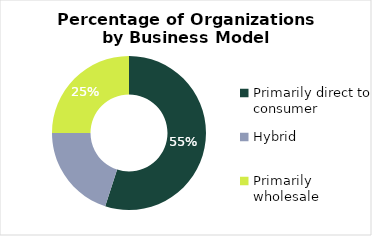
| Category | Total |
|---|---|
| Primarily direct to consumer | 0.55 |
| Hybrid | 0.2 |
| Primarily wholesale | 0.25 |